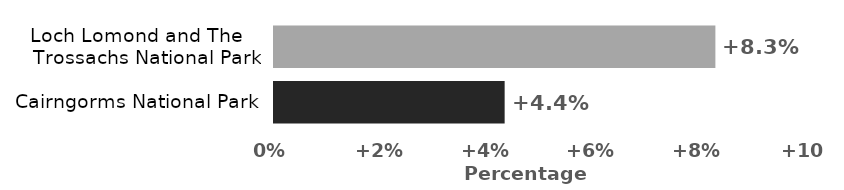
| Category | Percentage change |
|---|---|
| Cairngorms National Park | 4.36 |
| Loch Lomond and The
    Trossachs National Park | 8.344 |